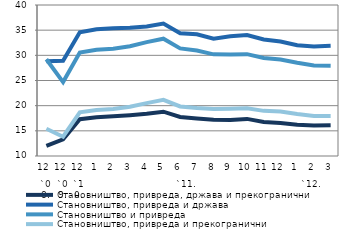
| Category | Становништво, привреда, држава и прекогранични | Становништво, привреда и држава | Становништво и привреда | Становништво, привреда и прекогранични |
|---|---|---|---|---|
| 0 | 12.02 | 28.82 | 29.22 | 15.42 |
| 1 | 13.31 | 28.94 | 24.68 | 13.83 |
| 2 | 17.3 | 34.6 | 30.54 | 18.69 |
| 3 | 17.7 | 35.2 | 31.12 | 19.15 |
| 4 | 17.91 | 35.36 | 31.31 | 19.34 |
| 5 | 18.11 | 35.47 | 31.82 | 19.77 |
| 6 | 18.38 | 35.75 | 32.62 | 20.51 |
| 7 | 18.8 | 36.31 | 33.3 | 21.15 |
| 8 | 17.76 | 34.39 | 31.37 | 19.85 |
| 9 | 17.47 | 34.2 | 30.95 | 19.53 |
| 10 | 17.2 | 33.32 | 30.2 | 19.32 |
| 11 | 17.13 | 33.77 | 30.19 | 19.38 |
| 12 | 17.37 | 34.04 | 30.23 | 19.5 |
| 13 | 16.77 | 33.15 | 29.46 | 18.97 |
| 14 | 16.55 | 32.74 | 29.18 | 18.85 |
| 15 | 16.197 | 31.999 | 28.527 | 18.365 |
| 16 | 16.043 | 31.779 | 27.981 | 17.962 |
| 17 | 16.117 | 31.898 | 27.929 | 17.935 |